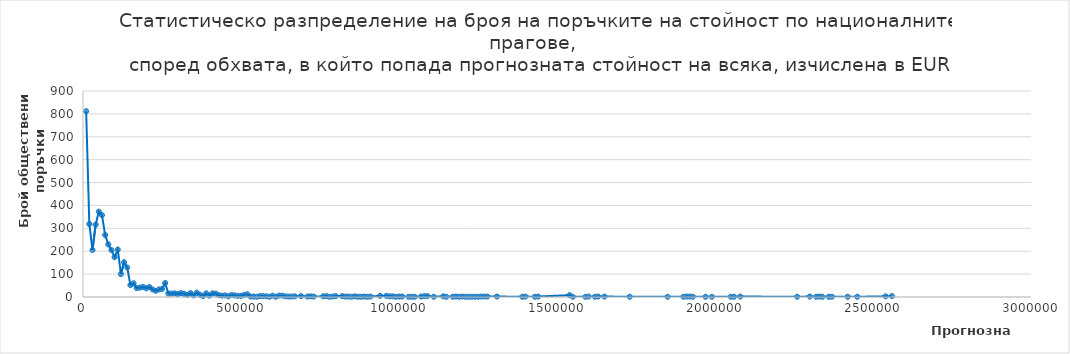
| Category | Series 0 |
|---|---|
| 10000.0 | 812 |
| 20000.0 | 319 |
| 30000.0 | 205 |
| 40000.0 | 316 |
| 50000.0 | 373 |
| 60000.0 | 358 |
| 70000.0 | 271 |
| 80000.0 | 230 |
| 90000.0 | 205 |
| 100000.0 | 174 |
| 110000.0 | 207 |
| 120000.0 | 100 |
| 130000.0 | 152 |
| 140000.0 | 129 |
| 150000.0 | 52 |
| 160000.0 | 60 |
| 170000.0 | 39 |
| 180000.0 | 41 |
| 190000.0 | 44 |
| 200000.0 | 38 |
| 210000.0 | 44 |
| 220000.0 | 33 |
| 230000.0 | 27 |
| 240000.0 | 33 |
| 250000.0 | 35 |
| 260000.0 | 61 |
| 270000.0 | 15 |
| 280000.0 | 15 |
| 290000.0 | 16 |
| 300000.0 | 13 |
| 310000.0 | 17 |
| 320000.0 | 14 |
| 330000.0 | 9 |
| 340000.0 | 17 |
| 350000.0 | 7 |
| 360000.0 | 19 |
| 370000.0 | 10 |
| 380000.0 | 4 |
| 390000.0 | 16 |
| 400000.0 | 6 |
| 410000.0 | 16 |
| 420000.0 | 15 |
| 430000.0 | 8 |
| 440000.0 | 6 |
| 450000.0 | 7 |
| 460000.0 | 3 |
| 470000.0 | 9 |
| 480000.0 | 7 |
| 490000.0 | 5 |
| 500000.0 | 5 |
| 510000.0 | 9 |
| 520000.0 | 12 |
| 530000.0 | 2 |
| 540000.0 | 2 |
| 550000.0 | 1 |
| 560000.0 | 4 |
| 570000.0 | 4 |
| 580000.0 | 3 |
| 590000.0 | 1 |
| 600000.0 | 6 |
| 610000.0 | 1 |
| 620000.0 | 6 |
| 630000.0 | 6 |
| 640000.0 | 3 |
| 650000.0 | 2 |
| 660000.0 | 2 |
| 670000.0 | 3 |
| 690000.0 | 4 |
| 710000.0 | 2 |
| 720000.0 | 3 |
| 730000.0 | 2 |
| 760000.0 | 3 |
| 770000.0 | 4 |
| 780000.0 | 1 |
| 790000.0 | 2 |
| 800000.0 | 4 |
| 820000.0 | 4 |
| 830000.0 | 2 |
| 840000.0 | 2 |
| 850000.0 | 1 |
| 860000.0 | 3 |
| 870000.0 | 1 |
| 880000.0 | 1 |
| 890000.0 | 2 |
| 900000.0 | 1 |
| 910000.0 | 2 |
| 940000.0 | 5 |
| 960000.0 | 5 |
| 970000.0 | 3 |
| 980000.0 | 3 |
| 990000.0 | 1 |
| 1000000.0 | 2 |
| 1010000.0 | 2 |
| 1030000.0 | 1 |
| 1040000.0 | 1 |
| 1050000.0 | 1 |
| 1070000.0 | 2 |
| 1080000.0 | 4 |
| 1090000.0 | 4 |
| 1110000.0 | 1 |
| 1140000.0 | 3 |
| 1150000.0 | 1 |
| 1170000.0 | 1 |
| 1180000.0 | 2 |
| 1190000.0 | 1 |
| 1200000.0 | 2 |
| 1210000.0 | 1 |
| 1220000.0 | 1 |
| 1230000.0 | 1 |
| 1240000.0 | 1 |
| 1250000.0 | 1 |
| 1260000.0 | 2 |
| 1270000.0 | 2 |
| 1280000.0 | 2 |
| 1310000.0 | 2 |
| 1390000.0 | 1 |
| 1400000.0 | 2 |
| 1430000.0 | 1 |
| 1440000.0 | 2 |
| 1540000.0 | 8 |
| 1550000.0 | 1 |
| 1590000.0 | 1 |
| 1600000.0 | 2 |
| 1620000.0 | 1 |
| 1630000.0 | 2 |
| 1650000.0 | 2 |
| 1730000.0 | 1 |
| 1850000.0 | 1 |
| 1900000.0 | 1 |
| 1910000.0 | 2 |
| 1920000.0 | 2 |
| 1930000.0 | 1 |
| 1970000.0 | 1 |
| 1990000.0 | 1 |
| 2050000.0 | 1 |
| 2060000.0 | 1 |
| 2080000.0 | 2 |
| 2260000.0 | 1 |
| 2300000.0 | 2 |
| 2320000.0 | 1 |
| 2330000.0 | 2 |
| 2340000.0 | 1 |
| 2360000.0 | 1 |
| 2370000.0 | 1 |
| 2420000.0 | 1 |
| 2450000.0 | 1 |
| 2540000.0 | 3 |
| 2560000.0 | 4 |